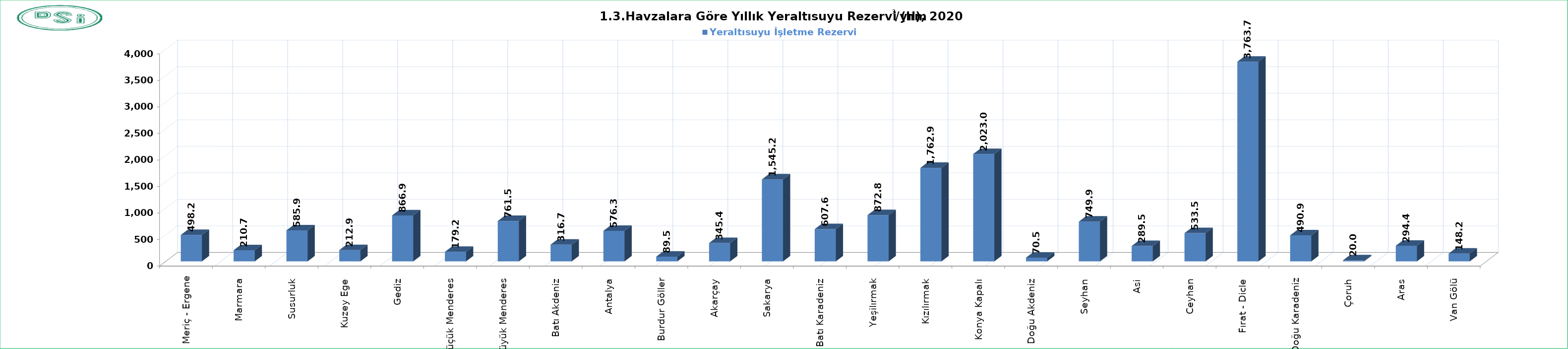
| Category | Yeraltısuyu İşletme Rezervi  |
|---|---|
| Meriç - Ergene | 498.2 |
| Marmara  | 210.7 |
| Susurluk  | 585.9 |
| Kuzey Ege  | 212.9 |
| Gediz  | 866.9 |
| Küçük Menderes  | 179.2 |
| Büyük Menderes  | 761.5 |
| Batı Akdeniz  | 316.7 |
| Antalya  | 576.3 |
| Burdur Göller  | 89.5 |
| Akarçay  | 345.4 |
| Sakarya  | 1545.2 |
| Batı Karadeniz  | 607.6 |
| Yeşilırmak  | 872.8 |
| Kızılırmak  | 1762.9 |
| Konya Kapalı  | 2023 |
| Doğu Akdeniz  | 70.5 |
| Seyhan  | 749.9 |
| Asi  | 289.5 |
| Ceyhan  | 533.5 |
| Fırat - Dicle  | 3763.7 |
| Doğu Karadeniz  | 490.9 |
| Çoruh  | 20 |
| Aras  | 294.4 |
| Van Gölü  | 148.2 |